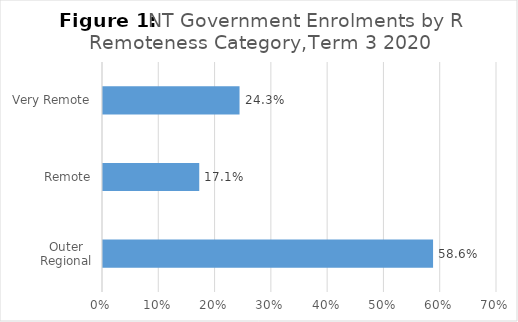
| Category | Enrolment |
|---|---|
| Outer Regional | 0.586 |
| Remote | 0.171 |
| Very Remote | 0.243 |